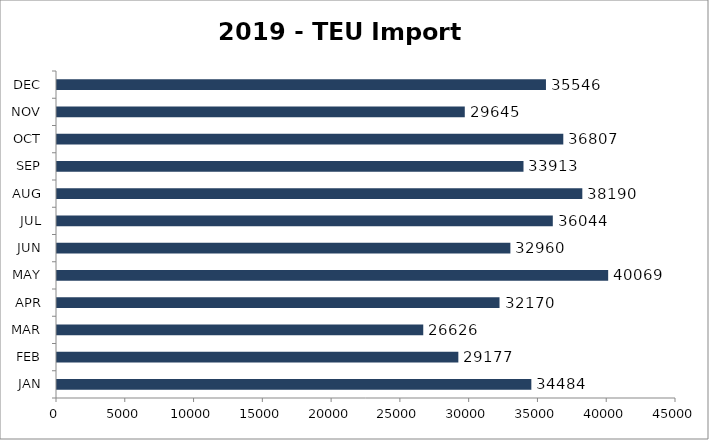
| Category | TEU |
|---|---|
| JAN | 34484 |
| FEB | 29177 |
| MAR | 26626 |
| APR | 32170 |
| MAY | 40069 |
| JUN | 32960 |
| JUL | 36044 |
| AUG | 38190 |
| SEP | 33913 |
| OCT | 36807 |
| NOV | 29645 |
| DEC | 35546 |